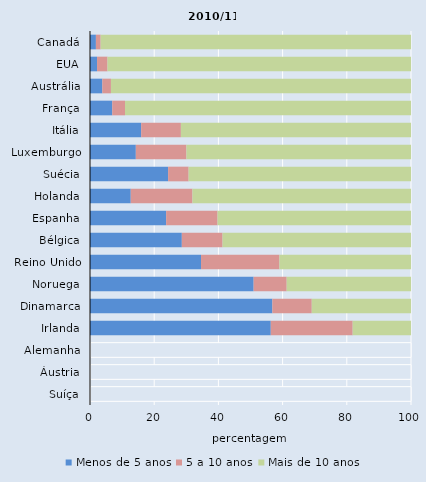
| Category | Menos de 5 anos | 5 a 10 anos | Mais de 10 anos |
|---|---|---|---|
| Canadá | 1.84 | 1.477 | 96.683 |
| EUA | 2.197 | 3.256 | 94.546 |
| Austrália | 3.835 | 2.69 | 93.475 |
| França | 6.931 | 3.976 | 89.094 |
| Itália | 15.946 | 12.368 | 71.686 |
| Luxemburgo | 14.278 | 15.763 | 69.959 |
| Suécia | 24.334 | 6.394 | 69.272 |
| Holanda | 12.693 | 19.225 | 68.082 |
| Espanha | 23.721 | 16.018 | 60.261 |
| Bélgica | 28.606 | 12.687 | 58.707 |
| Reino Unido | 34.587 | 24.425 | 40.987 |
| Noruega | 50.977 | 10.302 | 38.721 |
| Dinamarca | 56.808 | 12.277 | 30.915 |
| Irlanda | 56.315 | 25.519 | 18.166 |
| Alemanha | 100 | 0 | 0 |
| Áustria | 100 | 0 | 0 |
| Suíça | 100 | 0 | 0 |